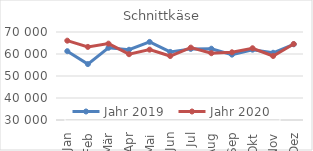
| Category | Jahr 2019 | Jahr 2020 |
|---|---|---|
| Jan | 61284.062 | 66056.772 |
| Feb | 55413.084 | 63223.054 |
| Mär | 62817.573 | 64708.801 |
| Apr | 61920.575 | 59905.812 |
| Mai | 65490.711 | 61977.131 |
| Jun | 60950.908 | 59072.71 |
| Jul | 62323.96 | 62900.157 |
| Aug | 62404.529 | 60359.644 |
| Sep | 59709.01 | 60774.465 |
| Okt | 61968.869 | 62617.478 |
| Nov | 60558.343 | 59091.433 |
| Dez | 64420.732 | 64542.928 |